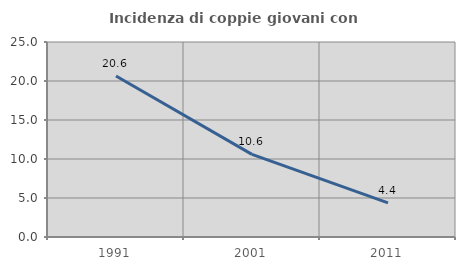
| Category | Incidenza di coppie giovani con figli |
|---|---|
| 1991.0 | 20.647 |
| 2001.0 | 10.592 |
| 2011.0 | 4.376 |